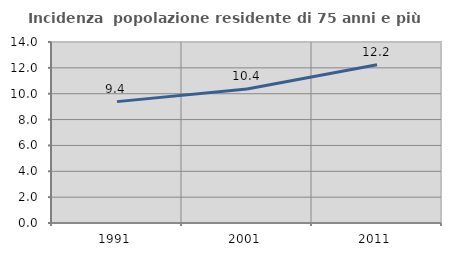
| Category | Incidenza  popolazione residente di 75 anni e più |
|---|---|
| 1991.0 | 9.388 |
| 2001.0 | 10.359 |
| 2011.0 | 12.233 |